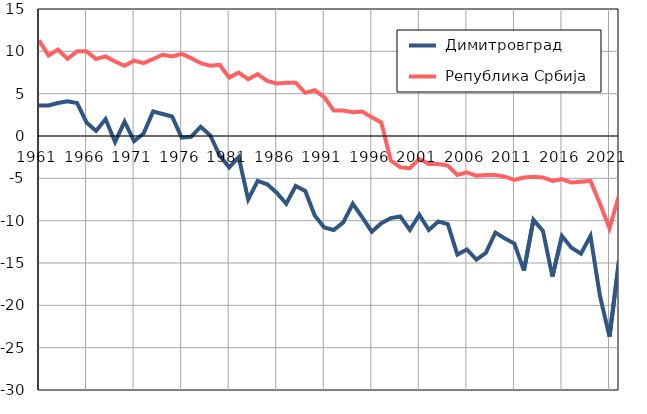
| Category |  Димитровград |  Република Србија |
|---|---|---|
| 1961.0 | 3.6 | 11.3 |
| 1962.0 | 3.6 | 9.5 |
| 1963.0 | 3.9 | 10.2 |
| 1964.0 | 4.1 | 9.1 |
| 1965.0 | 3.9 | 10 |
| 1966.0 | 1.6 | 10 |
| 1967.0 | 0.6 | 9.1 |
| 1968.0 | 2 | 9.4 |
| 1969.0 | -0.7 | 8.8 |
| 1970.0 | 1.7 | 8.3 |
| 1971.0 | -0.6 | 8.9 |
| 1972.0 | 0.3 | 8.6 |
| 1973.0 | 2.9 | 9.1 |
| 1974.0 | 2.6 | 9.6 |
| 1975.0 | 2.3 | 9.4 |
| 1976.0 | -0.2 | 9.7 |
| 1977.0 | -0.1 | 9.2 |
| 1978.0 | 1.1 | 8.6 |
| 1979.0 | 0.1 | 8.3 |
| 1980.0 | -2.3 | 8.4 |
| 1981.0 | -3.7 | 6.9 |
| 1982.0 | -2.5 | 7.5 |
| 1983.0 | -7.5 | 6.7 |
| 1984.0 | -5.3 | 7.3 |
| 1985.0 | -5.7 | 6.5 |
| 1986.0 | -6.7 | 6.2 |
| 1987.0 | -8 | 6.3 |
| 1988.0 | -5.9 | 6.3 |
| 1989.0 | -6.5 | 5.1 |
| 1990.0 | -9.4 | 5.4 |
| 1991.0 | -10.8 | 4.6 |
| 1992.0 | -11.1 | 3 |
| 1993.0 | -10.2 | 3 |
| 1994.0 | -8 | 2.8 |
| 1995.0 | -9.6 | 2.9 |
| 1996.0 | -11.3 | 2.2 |
| 1997.0 | -10.3 | 1.6 |
| 1998.0 | -9.7 | -2.9 |
| 1999.0 | -9.5 | -3.7 |
| 2000.0 | -11.1 | -3.8 |
| 2001.0 | -9.3 | -2.7 |
| 2002.0 | -11.1 | -3.3 |
| 2003.0 | -10.1 | -3.3 |
| 2004.0 | -10.4 | -3.5 |
| 2005.0 | -14 | -4.6 |
| 2006.0 | -13.4 | -4.3 |
| 2007.0 | -14.6 | -4.7 |
| 2008.0 | -13.8 | -4.6 |
| 2009.0 | -11.4 | -4.6 |
| 2010.0 | -12.1 | -4.8 |
| 2011.0 | -12.7 | -5.2 |
| 2012.0 | -15.9 | -4.9 |
| 2013.0 | -9.9 | -4.8 |
| 2014.0 | -11.2 | -4.9 |
| 2015.0 | -16.6 | -5.3 |
| 2016.0 | -11.8 | -5.1 |
| 2017.0 | -13.2 | -5.5 |
| 2018.0 | -13.9 | -5.4 |
| 2019.0 | -11.8 | -5.3 |
| 2020.0 | -18.9 | -8 |
| 2021.0 | -23.7 | -10.9 |
| 2022.0 | -14.7 | -7 |